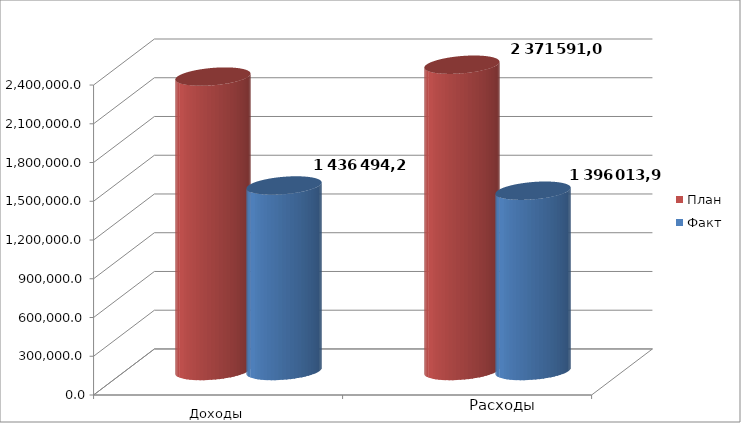
| Category | План | Факт |
|---|---|---|
| 0 | 2279611.4 | 1436494.2 |
| 1 | 2371591 | 1396013.9 |